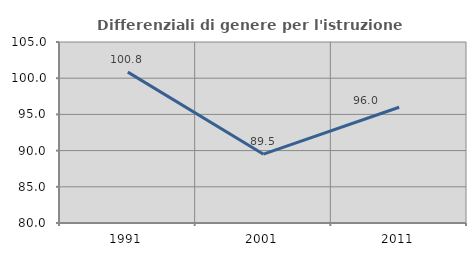
| Category | Differenziali di genere per l'istruzione superiore |
|---|---|
| 1991.0 | 100.841 |
| 2001.0 | 89.505 |
| 2011.0 | 95.993 |